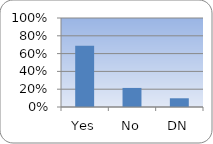
| Category | Series 0 |
|---|---|
| Yes | 0.688 |
| No | 0.214 |
| DN | 0.098 |